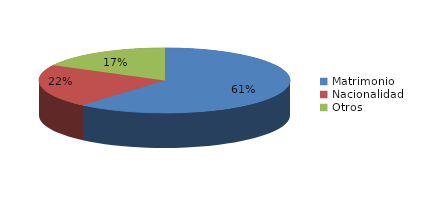
| Category | Series 0 |
|---|---|
| Matrimonio | 7342 |
| Nacionalidad | 2584 |
| Otros | 2062 |